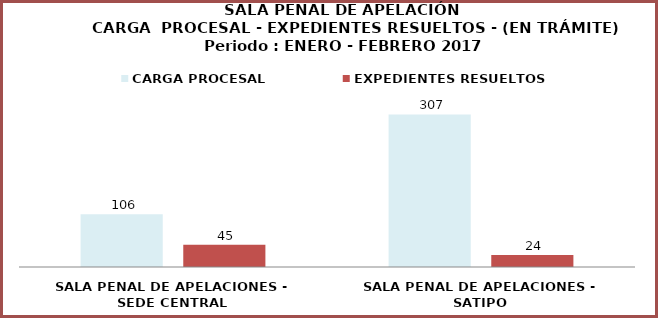
| Category | CARGA PROCESAL | EXPEDIENTES RESUELTOS |
|---|---|---|
| SALA PENAL DE APELACIONES - SEDE CENTRAL | 106 | 45 |
| SALA PENAL DE APELACIONES - SATIPO | 307 | 24 |